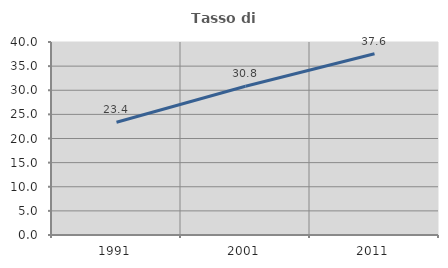
| Category | Tasso di occupazione   |
|---|---|
| 1991.0 | 23.382 |
| 2001.0 | 30.828 |
| 2011.0 | 37.576 |